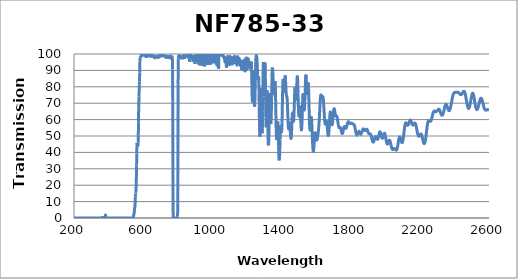
| Category | Transmission (%) |
|---|---|
| 2600.0 | 65.392 |
| 2599.0 | 65.569 |
| 2598.0 | 65.712 |
| 2597.0 | 65.833 |
| 2596.0 | 65.933 |
| 2595.0 | 66.007 |
| 2594.0 | 66.052 |
| 2593.0 | 66.114 |
| 2592.0 | 66.077 |
| 2591.0 | 66.056 |
| 2590.0 | 66.05 |
| 2589.0 | 66.052 |
| 2588.0 | 66.001 |
| 2587.0 | 65.917 |
| 2586.0 | 65.876 |
| 2585.0 | 65.834 |
| 2584.0 | 65.83 |
| 2583.0 | 65.81 |
| 2582.0 | 65.764 |
| 2581.0 | 65.782 |
| 2580.0 | 65.828 |
| 2579.0 | 65.907 |
| 2578.0 | 66.003 |
| 2577.0 | 66.11 |
| 2576.0 | 66.23 |
| 2575.0 | 66.378 |
| 2574.0 | 66.574 |
| 2573.0 | 66.798 |
| 2572.0 | 67.039 |
| 2571.0 | 67.352 |
| 2570.0 | 67.721 |
| 2569.0 | 68.146 |
| 2568.0 | 68.59 |
| 2567.0 | 69.084 |
| 2566.0 | 69.505 |
| 2565.0 | 69.982 |
| 2564.0 | 70.445 |
| 2563.0 | 70.91 |
| 2562.0 | 71.297 |
| 2561.0 | 71.649 |
| 2560.0 | 71.98 |
| 2559.0 | 72.282 |
| 2558.0 | 72.572 |
| 2557.0 | 72.751 |
| 2556.0 | 72.898 |
| 2555.0 | 72.986 |
| 2554.0 | 73.059 |
| 2553.0 | 73.054 |
| 2552.0 | 72.981 |
| 2551.0 | 72.816 |
| 2550.0 | 72.572 |
| 2549.0 | 72.279 |
| 2548.0 | 71.984 |
| 2547.0 | 71.616 |
| 2546.0 | 71.232 |
| 2545.0 | 70.837 |
| 2544.0 | 70.409 |
| 2543.0 | 69.989 |
| 2542.0 | 69.563 |
| 2541.0 | 69.101 |
| 2540.0 | 68.692 |
| 2539.0 | 68.259 |
| 2538.0 | 67.835 |
| 2537.0 | 67.445 |
| 2536.0 | 67.096 |
| 2535.0 | 66.797 |
| 2534.0 | 66.562 |
| 2533.0 | 66.352 |
| 2532.0 | 66.209 |
| 2531.0 | 66.12 |
| 2530.0 | 66.064 |
| 2529.0 | 66.136 |
| 2528.0 | 66.3 |
| 2527.0 | 66.479 |
| 2526.0 | 66.714 |
| 2525.0 | 66.999 |
| 2524.0 | 67.356 |
| 2523.0 | 67.778 |
| 2522.0 | 68.26 |
| 2521.0 | 68.773 |
| 2520.0 | 69.35 |
| 2519.0 | 69.96 |
| 2518.0 | 70.579 |
| 2517.0 | 71.29 |
| 2516.0 | 71.95 |
| 2515.0 | 72.606 |
| 2514.0 | 73.218 |
| 2513.0 | 73.827 |
| 2512.0 | 74.378 |
| 2511.0 | 74.853 |
| 2510.0 | 75.248 |
| 2509.0 | 75.572 |
| 2508.0 | 75.848 |
| 2507.0 | 75.979 |
| 2506.0 | 76.055 |
| 2505.0 | 76.059 |
| 2504.0 | 75.941 |
| 2503.0 | 75.688 |
| 2502.0 | 75.381 |
| 2501.0 | 75.04 |
| 2500.0 | 74.624 |
| 2499.0 | 74.088 |
| 2498.0 | 73.537 |
| 2497.0 | 72.972 |
| 2496.0 | 72.404 |
| 2495.0 | 71.796 |
| 2494.0 | 71.179 |
| 2493.0 | 70.555 |
| 2492.0 | 69.954 |
| 2491.0 | 69.397 |
| 2490.0 | 68.921 |
| 2489.0 | 68.477 |
| 2488.0 | 68.054 |
| 2487.0 | 67.668 |
| 2486.0 | 67.337 |
| 2485.0 | 67.088 |
| 2484.0 | 66.941 |
| 2483.0 | 66.849 |
| 2482.0 | 66.819 |
| 2481.0 | 66.855 |
| 2480.0 | 66.971 |
| 2479.0 | 67.151 |
| 2478.0 | 67.407 |
| 2477.0 | 67.737 |
| 2476.0 | 68.134 |
| 2475.0 | 68.574 |
| 2474.0 | 69.086 |
| 2473.0 | 69.625 |
| 2472.0 | 70.196 |
| 2471.0 | 70.812 |
| 2470.0 | 71.411 |
| 2469.0 | 72.019 |
| 2468.0 | 72.648 |
| 2467.0 | 73.296 |
| 2466.0 | 73.874 |
| 2465.0 | 74.433 |
| 2464.0 | 74.97 |
| 2463.0 | 75.485 |
| 2462.0 | 75.889 |
| 2461.0 | 76.26 |
| 2460.0 | 76.544 |
| 2459.0 | 76.79 |
| 2458.0 | 77.011 |
| 2457.0 | 77.162 |
| 2456.0 | 77.234 |
| 2455.0 | 77.255 |
| 2454.0 | 77.234 |
| 2453.0 | 77.16 |
| 2452.0 | 77.054 |
| 2451.0 | 76.942 |
| 2450.0 | 76.807 |
| 2449.0 | 76.628 |
| 2448.0 | 76.45 |
| 2447.0 | 76.275 |
| 2446.0 | 76.106 |
| 2445.0 | 75.931 |
| 2444.0 | 75.772 |
| 2443.0 | 75.622 |
| 2442.0 | 75.512 |
| 2441.0 | 75.399 |
| 2440.0 | 75.288 |
| 2439.0 | 75.223 |
| 2438.0 | 75.197 |
| 2437.0 | 75.196 |
| 2436.0 | 75.216 |
| 2435.0 | 75.24 |
| 2434.0 | 75.305 |
| 2433.0 | 75.419 |
| 2432.0 | 75.549 |
| 2431.0 | 75.673 |
| 2430.0 | 75.783 |
| 2429.0 | 75.884 |
| 2428.0 | 76.011 |
| 2427.0 | 76.131 |
| 2426.0 | 76.223 |
| 2425.0 | 76.307 |
| 2424.0 | 76.385 |
| 2423.0 | 76.463 |
| 2422.0 | 76.546 |
| 2421.0 | 76.616 |
| 2420.0 | 76.647 |
| 2419.0 | 76.647 |
| 2418.0 | 76.644 |
| 2417.0 | 76.643 |
| 2416.0 | 76.65 |
| 2415.0 | 76.65 |
| 2414.0 | 76.644 |
| 2413.0 | 76.627 |
| 2412.0 | 76.619 |
| 2411.0 | 76.622 |
| 2410.0 | 76.607 |
| 2409.0 | 76.602 |
| 2408.0 | 76.606 |
| 2407.0 | 76.613 |
| 2406.0 | 76.616 |
| 2405.0 | 76.615 |
| 2404.0 | 76.611 |
| 2403.0 | 76.58 |
| 2402.0 | 76.531 |
| 2401.0 | 76.476 |
| 2400.0 | 76.444 |
| 2399.0 | 76.409 |
| 2398.0 | 76.325 |
| 2397.0 | 76.189 |
| 2396.0 | 76.01 |
| 2395.0 | 75.796 |
| 2394.0 | 75.561 |
| 2393.0 | 75.313 |
| 2392.0 | 74.987 |
| 2391.0 | 74.599 |
| 2390.0 | 74.17 |
| 2389.0 | 73.706 |
| 2388.0 | 73.204 |
| 2387.0 | 72.679 |
| 2386.0 | 72.137 |
| 2385.0 | 71.579 |
| 2384.0 | 71.007 |
| 2383.0 | 70.424 |
| 2382.0 | 69.843 |
| 2381.0 | 69.275 |
| 2380.0 | 68.702 |
| 2379.0 | 68.167 |
| 2378.0 | 67.665 |
| 2377.0 | 67.224 |
| 2376.0 | 66.84 |
| 2375.0 | 66.502 |
| 2374.0 | 66.164 |
| 2373.0 | 65.874 |
| 2372.0 | 65.662 |
| 2371.0 | 65.535 |
| 2370.0 | 65.459 |
| 2369.0 | 65.438 |
| 2368.0 | 65.477 |
| 2367.0 | 65.561 |
| 2366.0 | 65.687 |
| 2365.0 | 65.869 |
| 2364.0 | 66.115 |
| 2363.0 | 66.384 |
| 2362.0 | 66.668 |
| 2361.0 | 66.985 |
| 2360.0 | 67.341 |
| 2359.0 | 67.702 |
| 2358.0 | 68.036 |
| 2357.0 | 68.313 |
| 2356.0 | 68.567 |
| 2355.0 | 68.815 |
| 2354.0 | 69.021 |
| 2353.0 | 69.188 |
| 2352.0 | 69.291 |
| 2351.0 | 69.297 |
| 2350.0 | 69.217 |
| 2349.0 | 69.112 |
| 2348.0 | 68.929 |
| 2347.0 | 68.699 |
| 2346.0 | 68.378 |
| 2345.0 | 68.01 |
| 2344.0 | 67.616 |
| 2343.0 | 67.184 |
| 2342.0 | 66.73 |
| 2341.0 | 66.258 |
| 2340.0 | 65.758 |
| 2339.0 | 65.282 |
| 2338.0 | 64.845 |
| 2337.0 | 64.443 |
| 2336.0 | 64.053 |
| 2335.0 | 63.687 |
| 2334.0 | 63.375 |
| 2333.0 | 63.109 |
| 2332.0 | 62.893 |
| 2331.0 | 62.749 |
| 2330.0 | 62.664 |
| 2329.0 | 62.631 |
| 2328.0 | 62.658 |
| 2327.0 | 62.703 |
| 2326.0 | 62.792 |
| 2325.0 | 62.936 |
| 2324.0 | 63.129 |
| 2323.0 | 63.364 |
| 2322.0 | 63.613 |
| 2321.0 | 63.92 |
| 2320.0 | 64.245 |
| 2319.0 | 64.555 |
| 2318.0 | 64.844 |
| 2317.0 | 65.141 |
| 2316.0 | 65.392 |
| 2315.0 | 65.642 |
| 2314.0 | 65.861 |
| 2313.0 | 66.066 |
| 2312.0 | 66.227 |
| 2311.0 | 66.312 |
| 2310.0 | 66.341 |
| 2309.0 | 66.341 |
| 2308.0 | 66.301 |
| 2307.0 | 66.231 |
| 2306.0 | 66.153 |
| 2305.0 | 66.035 |
| 2304.0 | 65.872 |
| 2303.0 | 65.712 |
| 2302.0 | 65.555 |
| 2301.0 | 65.421 |
| 2300.0 | 65.268 |
| 2299.0 | 65.144 |
| 2298.0 | 65.053 |
| 2297.0 | 64.975 |
| 2296.0 | 64.936 |
| 2295.0 | 64.87 |
| 2294.0 | 64.835 |
| 2293.0 | 64.83 |
| 2292.0 | 64.857 |
| 2291.0 | 64.901 |
| 2290.0 | 64.963 |
| 2289.0 | 65.046 |
| 2288.0 | 65.121 |
| 2287.0 | 65.16 |
| 2286.0 | 65.197 |
| 2285.0 | 65.22 |
| 2284.0 | 65.219 |
| 2283.0 | 65.169 |
| 2282.0 | 65.091 |
| 2281.0 | 64.98 |
| 2280.0 | 64.812 |
| 2279.0 | 64.631 |
| 2278.0 | 64.383 |
| 2277.0 | 64.058 |
| 2276.0 | 63.702 |
| 2275.0 | 63.325 |
| 2274.0 | 62.902 |
| 2273.0 | 62.465 |
| 2272.0 | 62.015 |
| 2271.0 | 61.587 |
| 2270.0 | 61.133 |
| 2269.0 | 60.74 |
| 2268.0 | 60.393 |
| 2267.0 | 60.045 |
| 2266.0 | 59.742 |
| 2265.0 | 59.493 |
| 2264.0 | 59.269 |
| 2263.0 | 59.108 |
| 2262.0 | 59.016 |
| 2261.0 | 58.966 |
| 2260.0 | 58.954 |
| 2259.0 | 58.952 |
| 2258.0 | 59.022 |
| 2257.0 | 59.155 |
| 2256.0 | 59.275 |
| 2255.0 | 59.371 |
| 2254.0 | 59.445 |
| 2253.0 | 59.472 |
| 2252.0 | 59.451 |
| 2251.0 | 59.435 |
| 2250.0 | 59.334 |
| 2249.0 | 59.173 |
| 2248.0 | 58.926 |
| 2247.0 | 58.584 |
| 2246.0 | 58.147 |
| 2245.0 | 57.635 |
| 2244.0 | 57.051 |
| 2243.0 | 56.355 |
| 2242.0 | 55.578 |
| 2241.0 | 54.774 |
| 2240.0 | 53.89 |
| 2239.0 | 53.035 |
| 2238.0 | 52.113 |
| 2237.0 | 51.259 |
| 2236.0 | 50.404 |
| 2235.0 | 49.577 |
| 2234.0 | 48.798 |
| 2233.0 | 48.076 |
| 2232.0 | 47.42 |
| 2231.0 | 46.856 |
| 2230.0 | 46.356 |
| 2229.0 | 45.979 |
| 2228.0 | 45.703 |
| 2227.0 | 45.499 |
| 2226.0 | 45.386 |
| 2225.0 | 45.328 |
| 2224.0 | 45.396 |
| 2223.0 | 45.529 |
| 2222.0 | 45.768 |
| 2221.0 | 46.08 |
| 2220.0 | 46.447 |
| 2219.0 | 46.852 |
| 2218.0 | 47.315 |
| 2217.0 | 47.786 |
| 2216.0 | 48.29 |
| 2215.0 | 48.755 |
| 2214.0 | 49.233 |
| 2213.0 | 49.713 |
| 2212.0 | 50.107 |
| 2211.0 | 50.447 |
| 2210.0 | 50.719 |
| 2209.0 | 50.936 |
| 2208.0 | 51.076 |
| 2207.0 | 51.149 |
| 2206.0 | 51.204 |
| 2205.0 | 51.189 |
| 2204.0 | 51.124 |
| 2203.0 | 50.978 |
| 2202.0 | 50.783 |
| 2201.0 | 50.603 |
| 2200.0 | 50.431 |
| 2199.0 | 50.266 |
| 2198.0 | 50.106 |
| 2197.0 | 49.983 |
| 2196.0 | 49.88 |
| 2195.0 | 49.856 |
| 2194.0 | 49.85 |
| 2193.0 | 49.902 |
| 2192.0 | 49.999 |
| 2191.0 | 50.164 |
| 2190.0 | 50.431 |
| 2189.0 | 50.716 |
| 2188.0 | 51.083 |
| 2187.0 | 51.518 |
| 2186.0 | 51.992 |
| 2185.0 | 52.482 |
| 2184.0 | 53.045 |
| 2183.0 | 53.653 |
| 2182.0 | 54.217 |
| 2181.0 | 54.83 |
| 2180.0 | 55.368 |
| 2179.0 | 55.875 |
| 2178.0 | 56.347 |
| 2177.0 | 56.821 |
| 2176.0 | 57.155 |
| 2175.0 | 57.429 |
| 2174.0 | 57.618 |
| 2173.0 | 57.769 |
| 2172.0 | 57.888 |
| 2171.0 | 57.874 |
| 2170.0 | 57.807 |
| 2169.0 | 57.692 |
| 2168.0 | 57.545 |
| 2167.0 | 57.423 |
| 2166.0 | 57.256 |
| 2165.0 | 57.059 |
| 2164.0 | 56.901 |
| 2163.0 | 56.741 |
| 2162.0 | 56.638 |
| 2161.0 | 56.617 |
| 2160.0 | 56.62 |
| 2159.0 | 56.644 |
| 2158.0 | 56.736 |
| 2157.0 | 56.884 |
| 2156.0 | 57.14 |
| 2155.0 | 57.394 |
| 2154.0 | 57.67 |
| 2153.0 | 57.951 |
| 2152.0 | 58.289 |
| 2151.0 | 58.65 |
| 2150.0 | 58.939 |
| 2149.0 | 59.199 |
| 2148.0 | 59.406 |
| 2147.0 | 59.558 |
| 2146.0 | 59.686 |
| 2145.0 | 59.691 |
| 2144.0 | 59.682 |
| 2143.0 | 59.561 |
| 2142.0 | 59.381 |
| 2141.0 | 59.184 |
| 2140.0 | 58.93 |
| 2139.0 | 58.604 |
| 2138.0 | 58.248 |
| 2137.0 | 57.942 |
| 2136.0 | 57.637 |
| 2135.0 | 57.33 |
| 2134.0 | 57.076 |
| 2133.0 | 56.878 |
| 2132.0 | 56.725 |
| 2131.0 | 56.59 |
| 2130.0 | 56.507 |
| 2129.0 | 56.526 |
| 2128.0 | 56.609 |
| 2127.0 | 56.734 |
| 2126.0 | 56.876 |
| 2125.0 | 57.061 |
| 2124.0 | 57.294 |
| 2123.0 | 57.535 |
| 2122.0 | 57.726 |
| 2121.0 | 57.886 |
| 2120.0 | 58.003 |
| 2119.0 | 58.038 |
| 2118.0 | 57.981 |
| 2117.0 | 57.804 |
| 2116.0 | 57.503 |
| 2115.0 | 57.111 |
| 2114.0 | 56.593 |
| 2113.0 | 55.988 |
| 2112.0 | 55.234 |
| 2111.0 | 54.438 |
| 2110.0 | 53.562 |
| 2109.0 | 52.667 |
| 2108.0 | 51.734 |
| 2107.0 | 50.841 |
| 2106.0 | 49.953 |
| 2105.0 | 49.168 |
| 2104.0 | 48.407 |
| 2103.0 | 47.741 |
| 2102.0 | 47.183 |
| 2101.0 | 46.738 |
| 2100.0 | 46.382 |
| 2099.0 | 46.129 |
| 2098.0 | 45.999 |
| 2097.0 | 45.979 |
| 2096.0 | 46.036 |
| 2095.0 | 46.167 |
| 2094.0 | 46.39 |
| 2093.0 | 46.671 |
| 2092.0 | 47.017 |
| 2091.0 | 47.417 |
| 2090.0 | 47.808 |
| 2089.0 | 48.195 |
| 2088.0 | 48.561 |
| 2087.0 | 48.913 |
| 2086.0 | 49.168 |
| 2085.0 | 49.332 |
| 2084.0 | 49.405 |
| 2083.0 | 49.385 |
| 2082.0 | 49.257 |
| 2081.0 | 49.034 |
| 2080.0 | 48.679 |
| 2079.0 | 48.213 |
| 2078.0 | 47.654 |
| 2077.0 | 47.046 |
| 2076.0 | 46.442 |
| 2075.0 | 45.805 |
| 2074.0 | 45.115 |
| 2073.0 | 44.457 |
| 2072.0 | 43.848 |
| 2071.0 | 43.308 |
| 2070.0 | 42.828 |
| 2069.0 | 42.4 |
| 2068.0 | 42.047 |
| 2067.0 | 41.775 |
| 2066.0 | 41.597 |
| 2065.0 | 41.481 |
| 2064.0 | 41.404 |
| 2063.0 | 41.387 |
| 2062.0 | 41.444 |
| 2061.0 | 41.556 |
| 2060.0 | 41.667 |
| 2059.0 | 41.789 |
| 2058.0 | 41.915 |
| 2057.0 | 42.056 |
| 2056.0 | 42.206 |
| 2055.0 | 42.303 |
| 2054.0 | 42.35 |
| 2053.0 | 42.37 |
| 2052.0 | 42.362 |
| 2051.0 | 42.343 |
| 2050.0 | 42.303 |
| 2049.0 | 42.216 |
| 2048.0 | 42.107 |
| 2047.0 | 42.011 |
| 2046.0 | 41.938 |
| 2045.0 | 41.856 |
| 2044.0 | 41.787 |
| 2043.0 | 41.754 |
| 2042.0 | 41.794 |
| 2041.0 | 41.888 |
| 2040.0 | 42.018 |
| 2039.0 | 42.209 |
| 2038.0 | 42.465 |
| 2037.0 | 42.816 |
| 2036.0 | 43.213 |
| 2035.0 | 43.634 |
| 2034.0 | 44.086 |
| 2033.0 | 44.561 |
| 2032.0 | 45.092 |
| 2031.0 | 45.608 |
| 2030.0 | 46.072 |
| 2029.0 | 46.509 |
| 2028.0 | 46.88 |
| 2027.0 | 47.142 |
| 2026.0 | 47.312 |
| 2025.0 | 47.403 |
| 2024.0 | 47.418 |
| 2023.0 | 47.343 |
| 2022.0 | 47.169 |
| 2021.0 | 46.926 |
| 2020.0 | 46.644 |
| 2019.0 | 46.35 |
| 2018.0 | 46.05 |
| 2017.0 | 45.751 |
| 2016.0 | 45.477 |
| 2015.0 | 45.267 |
| 2014.0 | 45.143 |
| 2013.0 | 45.07 |
| 2012.0 | 45.057 |
| 2011.0 | 45.161 |
| 2010.0 | 45.36 |
| 2009.0 | 45.627 |
| 2008.0 | 45.971 |
| 2007.0 | 46.398 |
| 2006.0 | 46.908 |
| 2005.0 | 47.502 |
| 2004.0 | 48.126 |
| 2003.0 | 48.756 |
| 2002.0 | 49.373 |
| 2001.0 | 49.956 |
| 2000.0 | 50.493 |
| 1999.0 | 50.958 |
| 1998.0 | 51.348 |
| 1997.0 | 51.611 |
| 1996.0 | 51.704 |
| 1995.0 | 51.689 |
| 1994.0 | 51.563 |
| 1993.0 | 51.325 |
| 1992.0 | 51.027 |
| 1991.0 | 50.681 |
| 1990.0 | 50.28 |
| 1989.0 | 49.865 |
| 1988.0 | 49.491 |
| 1987.0 | 49.151 |
| 1986.0 | 48.878 |
| 1985.0 | 48.69 |
| 1984.0 | 48.59 |
| 1983.0 | 48.575 |
| 1982.0 | 48.665 |
| 1981.0 | 48.863 |
| 1980.0 | 49.138 |
| 1979.0 | 49.478 |
| 1978.0 | 49.879 |
| 1977.0 | 50.319 |
| 1976.0 | 50.777 |
| 1975.0 | 51.241 |
| 1974.0 | 51.651 |
| 1973.0 | 52.009 |
| 1972.0 | 52.297 |
| 1971.0 | 52.479 |
| 1970.0 | 52.549 |
| 1969.0 | 52.524 |
| 1968.0 | 52.401 |
| 1967.0 | 52.131 |
| 1966.0 | 51.786 |
| 1965.0 | 51.393 |
| 1964.0 | 50.915 |
| 1963.0 | 50.426 |
| 1962.0 | 49.946 |
| 1961.0 | 49.439 |
| 1960.0 | 49.002 |
| 1959.0 | 48.641 |
| 1958.0 | 48.327 |
| 1957.0 | 48.072 |
| 1956.0 | 47.949 |
| 1955.0 | 47.919 |
| 1954.0 | 47.967 |
| 1953.0 | 48.069 |
| 1952.0 | 48.215 |
| 1951.0 | 48.44 |
| 1950.0 | 48.717 |
| 1949.0 | 49.013 |
| 1948.0 | 49.288 |
| 1947.0 | 49.483 |
| 1946.0 | 49.63 |
| 1945.0 | 49.702 |
| 1944.0 | 49.716 |
| 1943.0 | 49.674 |
| 1942.0 | 49.539 |
| 1941.0 | 49.295 |
| 1940.0 | 48.973 |
| 1939.0 | 48.599 |
| 1938.0 | 48.197 |
| 1937.0 | 47.804 |
| 1936.0 | 47.465 |
| 1935.0 | 47.104 |
| 1934.0 | 46.808 |
| 1933.0 | 46.572 |
| 1932.0 | 46.392 |
| 1931.0 | 46.303 |
| 1930.0 | 46.276 |
| 1929.0 | 46.337 |
| 1928.0 | 46.477 |
| 1927.0 | 46.686 |
| 1926.0 | 46.993 |
| 1925.0 | 47.381 |
| 1924.0 | 47.795 |
| 1923.0 | 48.266 |
| 1922.0 | 48.752 |
| 1921.0 | 49.211 |
| 1920.0 | 49.618 |
| 1919.0 | 49.984 |
| 1918.0 | 50.363 |
| 1917.0 | 50.702 |
| 1916.0 | 50.992 |
| 1915.0 | 51.16 |
| 1914.0 | 51.274 |
| 1913.0 | 51.291 |
| 1912.0 | 51.288 |
| 1911.0 | 51.223 |
| 1910.0 | 51.207 |
| 1909.0 | 51.257 |
| 1908.0 | 51.348 |
| 1907.0 | 51.427 |
| 1906.0 | 51.443 |
| 1905.0 | 51.495 |
| 1904.0 | 51.609 |
| 1903.0 | 51.796 |
| 1902.0 | 52.056 |
| 1901.0 | 52.348 |
| 1900.0 | 52.662 |
| 1899.0 | 52.96 |
| 1898.0 | 53.188 |
| 1897.0 | 53.477 |
| 1896.0 | 53.708 |
| 1895.0 | 53.908 |
| 1894.0 | 54.059 |
| 1893.0 | 54.178 |
| 1892.0 | 54.149 |
| 1891.0 | 54.033 |
| 1890.0 | 53.932 |
| 1889.0 | 53.794 |
| 1888.0 | 53.716 |
| 1887.0 | 53.661 |
| 1886.0 | 53.568 |
| 1885.0 | 53.449 |
| 1884.0 | 53.37 |
| 1883.0 | 53.36 |
| 1882.0 | 53.325 |
| 1881.0 | 53.362 |
| 1880.0 | 53.483 |
| 1879.0 | 53.666 |
| 1878.0 | 53.864 |
| 1877.0 | 54.047 |
| 1876.0 | 54.176 |
| 1875.0 | 54.271 |
| 1874.0 | 54.36 |
| 1873.0 | 54.333 |
| 1872.0 | 54.259 |
| 1871.0 | 54.116 |
| 1870.0 | 53.955 |
| 1869.0 | 53.635 |
| 1868.0 | 53.331 |
| 1867.0 | 53.051 |
| 1866.0 | 52.75 |
| 1865.0 | 52.447 |
| 1864.0 | 52.186 |
| 1863.0 | 51.946 |
| 1862.0 | 51.728 |
| 1861.0 | 51.508 |
| 1860.0 | 51.239 |
| 1859.0 | 51.073 |
| 1858.0 | 51.042 |
| 1857.0 | 51.123 |
| 1856.0 | 51.304 |
| 1855.0 | 51.524 |
| 1854.0 | 51.765 |
| 1853.0 | 51.942 |
| 1852.0 | 52.169 |
| 1851.0 | 52.398 |
| 1850.0 | 52.683 |
| 1849.0 | 52.849 |
| 1848.0 | 52.923 |
| 1847.0 | 52.741 |
| 1846.0 | 52.537 |
| 1845.0 | 52.405 |
| 1844.0 | 52.354 |
| 1843.0 | 52.298 |
| 1842.0 | 52.101 |
| 1841.0 | 51.688 |
| 1840.0 | 51.252 |
| 1839.0 | 50.874 |
| 1838.0 | 50.665 |
| 1837.0 | 50.575 |
| 1836.0 | 50.537 |
| 1835.0 | 50.561 |
| 1834.0 | 50.714 |
| 1833.0 | 50.99 |
| 1832.0 | 51.365 |
| 1831.0 | 51.829 |
| 1830.0 | 52.272 |
| 1829.0 | 52.716 |
| 1828.0 | 53.228 |
| 1827.0 | 53.833 |
| 1826.0 | 54.394 |
| 1825.0 | 54.982 |
| 1824.0 | 55.434 |
| 1823.0 | 55.891 |
| 1822.0 | 56.237 |
| 1821.0 | 56.553 |
| 1820.0 | 56.712 |
| 1819.0 | 56.834 |
| 1818.0 | 56.906 |
| 1817.0 | 57.101 |
| 1816.0 | 57.234 |
| 1815.0 | 57.312 |
| 1814.0 | 57.339 |
| 1813.0 | 57.37 |
| 1812.0 | 57.407 |
| 1811.0 | 57.443 |
| 1810.0 | 57.498 |
| 1809.0 | 57.573 |
| 1808.0 | 57.657 |
| 1807.0 | 57.758 |
| 1806.0 | 57.813 |
| 1805.0 | 57.841 |
| 1804.0 | 57.823 |
| 1803.0 | 57.809 |
| 1802.0 | 57.759 |
| 1801.0 | 57.762 |
| 1800.0 | 57.725 |
| 1799.0 | 57.668 |
| 1798.0 | 57.592 |
| 1797.0 | 57.602 |
| 1796.0 | 57.661 |
| 1795.0 | 57.737 |
| 1794.0 | 57.802 |
| 1793.0 | 57.927 |
| 1792.0 | 58.074 |
| 1791.0 | 58.223 |
| 1790.0 | 58.396 |
| 1789.0 | 58.536 |
| 1788.0 | 58.646 |
| 1787.0 | 58.727 |
| 1786.0 | 58.729 |
| 1785.0 | 58.601 |
| 1784.0 | 58.422 |
| 1783.0 | 58.16 |
| 1782.0 | 57.835 |
| 1781.0 | 57.436 |
| 1780.0 | 56.981 |
| 1779.0 | 56.52 |
| 1778.0 | 56.041 |
| 1777.0 | 55.661 |
| 1776.0 | 55.321 |
| 1775.0 | 55.029 |
| 1774.0 | 54.838 |
| 1773.0 | 54.724 |
| 1772.0 | 54.696 |
| 1771.0 | 54.752 |
| 1770.0 | 54.885 |
| 1769.0 | 55.056 |
| 1768.0 | 55.274 |
| 1767.0 | 55.485 |
| 1766.0 | 55.667 |
| 1765.0 | 55.775 |
| 1764.0 | 55.819 |
| 1763.0 | 55.75 |
| 1762.0 | 55.552 |
| 1761.0 | 55.254 |
| 1760.0 | 54.848 |
| 1759.0 | 54.372 |
| 1758.0 | 53.871 |
| 1757.0 | 53.321 |
| 1756.0 | 52.809 |
| 1755.0 | 52.319 |
| 1754.0 | 51.928 |
| 1753.0 | 51.65 |
| 1752.0 | 51.498 |
| 1751.0 | 51.479 |
| 1750.0 | 51.577 |
| 1749.0 | 51.813 |
| 1748.0 | 52.139 |
| 1747.0 | 52.582 |
| 1746.0 | 53.041 |
| 1745.0 | 53.533 |
| 1744.0 | 54.012 |
| 1743.0 | 54.452 |
| 1742.0 | 54.779 |
| 1741.0 | 55.031 |
| 1740.0 | 55.184 |
| 1739.0 | 55.248 |
| 1738.0 | 55.231 |
| 1737.0 | 55.183 |
| 1736.0 | 55.09 |
| 1735.0 | 55.034 |
| 1734.0 | 55.037 |
| 1733.0 | 55.107 |
| 1732.0 | 55.257 |
| 1731.0 | 55.516 |
| 1730.0 | 55.913 |
| 1729.0 | 56.437 |
| 1728.0 | 57.062 |
| 1727.0 | 57.797 |
| 1726.0 | 58.533 |
| 1725.0 | 59.296 |
| 1724.0 | 60.021 |
| 1723.0 | 60.7 |
| 1722.0 | 61.285 |
| 1721.0 | 61.718 |
| 1720.0 | 62.013 |
| 1719.0 | 62.18 |
| 1718.0 | 62.234 |
| 1717.0 | 62.225 |
| 1716.0 | 62.194 |
| 1715.0 | 62.178 |
| 1714.0 | 62.224 |
| 1713.0 | 62.408 |
| 1712.0 | 62.738 |
| 1711.0 | 63.189 |
| 1710.0 | 63.742 |
| 1709.0 | 64.393 |
| 1708.0 | 65.063 |
| 1707.0 | 65.718 |
| 1706.0 | 66.238 |
| 1705.0 | 66.58 |
| 1704.0 | 66.623 |
| 1703.0 | 66.351 |
| 1702.0 | 65.774 |
| 1701.0 | 64.908 |
| 1700.0 | 63.832 |
| 1699.0 | 62.592 |
| 1698.0 | 61.334 |
| 1697.0 | 60.065 |
| 1696.0 | 58.924 |
| 1695.0 | 57.982 |
| 1694.0 | 57.323 |
| 1693.0 | 56.963 |
| 1692.0 | 56.915 |
| 1691.0 | 57.177 |
| 1690.0 | 57.781 |
| 1689.0 | 58.682 |
| 1688.0 | 59.781 |
| 1687.0 | 61.005 |
| 1686.0 | 62.217 |
| 1685.0 | 63.331 |
| 1684.0 | 64.171 |
| 1683.0 | 64.63 |
| 1682.0 | 64.574 |
| 1681.0 | 63.98 |
| 1680.0 | 62.863 |
| 1679.0 | 61.287 |
| 1678.0 | 59.511 |
| 1677.0 | 57.648 |
| 1676.0 | 55.743 |
| 1675.0 | 53.985 |
| 1674.0 | 52.518 |
| 1673.0 | 51.375 |
| 1672.0 | 50.646 |
| 1671.0 | 50.289 |
| 1670.0 | 50.331 |
| 1669.0 | 50.728 |
| 1668.0 | 51.454 |
| 1667.0 | 52.437 |
| 1666.0 | 53.598 |
| 1665.0 | 54.861 |
| 1664.0 | 56.095 |
| 1663.0 | 57.203 |
| 1662.0 | 58.082 |
| 1661.0 | 58.699 |
| 1660.0 | 58.99 |
| 1659.0 | 58.961 |
| 1658.0 | 58.707 |
| 1657.0 | 58.308 |
| 1656.0 | 57.863 |
| 1655.0 | 57.49 |
| 1654.0 | 57.253 |
| 1653.0 | 57.225 |
| 1652.0 | 57.489 |
| 1651.0 | 58.115 |
| 1650.0 | 59.06 |
| 1649.0 | 60.26 |
| 1648.0 | 61.762 |
| 1647.0 | 63.509 |
| 1646.0 | 65.419 |
| 1645.0 | 67.4 |
| 1644.0 | 69.246 |
| 1643.0 | 70.868 |
| 1642.0 | 72.242 |
| 1641.0 | 73.217 |
| 1640.0 | 73.768 |
| 1639.0 | 73.999 |
| 1638.0 | 73.942 |
| 1637.0 | 73.727 |
| 1636.0 | 73.487 |
| 1635.0 | 73.337 |
| 1634.0 | 73.325 |
| 1633.0 | 73.475 |
| 1632.0 | 73.773 |
| 1631.0 | 74.176 |
| 1630.0 | 74.619 |
| 1629.0 | 74.966 |
| 1628.0 | 75.109 |
| 1627.0 | 74.948 |
| 1626.0 | 74.353 |
| 1625.0 | 73.293 |
| 1624.0 | 71.809 |
| 1623.0 | 69.972 |
| 1622.0 | 67.885 |
| 1621.0 | 65.711 |
| 1620.0 | 63.516 |
| 1619.0 | 61.347 |
| 1618.0 | 59.422 |
| 1617.0 | 57.732 |
| 1616.0 | 56.216 |
| 1615.0 | 54.897 |
| 1614.0 | 53.719 |
| 1613.0 | 52.701 |
| 1612.0 | 51.832 |
| 1611.0 | 51.054 |
| 1610.0 | 50.336 |
| 1609.0 | 49.664 |
| 1608.0 | 49.035 |
| 1607.0 | 48.475 |
| 1606.0 | 48.01 |
| 1605.0 | 47.678 |
| 1604.0 | 47.487 |
| 1603.0 | 47.457 |
| 1602.0 | 47.633 |
| 1601.0 | 48.011 |
| 1600.0 | 48.595 |
| 1599.0 | 49.347 |
| 1598.0 | 50.164 |
| 1597.0 | 50.93 |
| 1596.0 | 51.568 |
| 1595.0 | 51.928 |
| 1594.0 | 51.871 |
| 1593.0 | 51.364 |
| 1592.0 | 50.374 |
| 1591.0 | 49.029 |
| 1590.0 | 47.407 |
| 1589.0 | 45.714 |
| 1588.0 | 44.098 |
| 1587.0 | 42.684 |
| 1586.0 | 41.585 |
| 1585.0 | 40.896 |
| 1584.0 | 40.68 |
| 1583.0 | 40.961 |
| 1582.0 | 41.872 |
| 1581.0 | 43.265 |
| 1580.0 | 45.173 |
| 1579.0 | 47.534 |
| 1578.0 | 50.294 |
| 1577.0 | 53.21 |
| 1576.0 | 56.087 |
| 1575.0 | 58.504 |
| 1574.0 | 60.369 |
| 1573.0 | 61.286 |
| 1572.0 | 61.251 |
| 1571.0 | 60.442 |
| 1570.0 | 59.074 |
| 1569.0 | 57.429 |
| 1568.0 | 55.751 |
| 1567.0 | 54.486 |
| 1566.0 | 53.73 |
| 1565.0 | 53.609 |
| 1564.0 | 54.255 |
| 1563.0 | 55.741 |
| 1562.0 | 58.109 |
| 1561.0 | 61.225 |
| 1560.0 | 65.104 |
| 1559.0 | 69.454 |
| 1558.0 | 73.83 |
| 1557.0 | 77.761 |
| 1556.0 | 80.807 |
| 1555.0 | 82.421 |
| 1554.0 | 82.668 |
| 1553.0 | 81.852 |
| 1552.0 | 80.251 |
| 1551.0 | 78.454 |
| 1550.0 | 76.885 |
| 1549.0 | 75.963 |
| 1548.0 | 75.884 |
| 1547.0 | 76.623 |
| 1546.0 | 78.213 |
| 1545.0 | 80.428 |
| 1544.0 | 82.974 |
| 1543.0 | 85.308 |
| 1542.0 | 86.929 |
| 1541.0 | 87.444 |
| 1540.0 | 86.595 |
| 1539.0 | 84.428 |
| 1538.0 | 81.207 |
| 1537.0 | 77.707 |
| 1536.0 | 74.079 |
| 1535.0 | 70.866 |
| 1534.0 | 68.287 |
| 1533.0 | 66.563 |
| 1532.0 | 65.8 |
| 1531.0 | 66.022 |
| 1530.0 | 67.155 |
| 1529.0 | 68.866 |
| 1528.0 | 71.083 |
| 1527.0 | 73.302 |
| 1526.0 | 75.107 |
| 1525.0 | 75.979 |
| 1524.0 | 75.575 |
| 1523.0 | 73.838 |
| 1522.0 | 70.794 |
| 1521.0 | 67.237 |
| 1520.0 | 63.282 |
| 1519.0 | 59.871 |
| 1518.0 | 57.015 |
| 1517.0 | 54.965 |
| 1516.0 | 53.824 |
| 1515.0 | 53.702 |
| 1514.0 | 54.474 |
| 1513.0 | 56.019 |
| 1512.0 | 58.247 |
| 1511.0 | 60.838 |
| 1510.0 | 63.516 |
| 1509.0 | 65.83 |
| 1508.0 | 67.378 |
| 1507.0 | 67.92 |
| 1506.0 | 67.502 |
| 1505.0 | 66.335 |
| 1504.0 | 64.789 |
| 1503.0 | 63.356 |
| 1502.0 | 62.294 |
| 1501.0 | 62.041 |
| 1500.0 | 62.596 |
| 1499.0 | 64.093 |
| 1498.0 | 66.59 |
| 1497.0 | 69.968 |
| 1496.0 | 74.085 |
| 1495.0 | 78.265 |
| 1494.0 | 82.31 |
| 1493.0 | 85.311 |
| 1492.0 | 86.884 |
| 1491.0 | 86.694 |
| 1490.0 | 84.919 |
| 1489.0 | 82.222 |
| 1488.0 | 78.916 |
| 1487.0 | 76.187 |
| 1486.0 | 73.999 |
| 1485.0 | 72.665 |
| 1484.0 | 72.372 |
| 1483.0 | 73.071 |
| 1482.0 | 74.61 |
| 1481.0 | 76.551 |
| 1480.0 | 78.543 |
| 1479.0 | 79.852 |
| 1478.0 | 79.947 |
| 1477.0 | 78.697 |
| 1476.0 | 76.021 |
| 1475.0 | 72.621 |
| 1474.0 | 68.751 |
| 1473.0 | 65.324 |
| 1472.0 | 62.405 |
| 1471.0 | 60.345 |
| 1470.0 | 59.206 |
| 1469.0 | 59.022 |
| 1468.0 | 59.626 |
| 1467.0 | 60.801 |
| 1466.0 | 62.212 |
| 1465.0 | 63.449 |
| 1464.0 | 63.98 |
| 1463.0 | 63.658 |
| 1462.0 | 62.343 |
| 1461.0 | 60.219 |
| 1460.0 | 57.547 |
| 1459.0 | 54.67 |
| 1458.0 | 52.356 |
| 1457.0 | 50.414 |
| 1456.0 | 49.087 |
| 1455.0 | 48.523 |
| 1454.0 | 48.652 |
| 1453.0 | 49.489 |
| 1452.0 | 50.831 |
| 1451.0 | 52.611 |
| 1450.0 | 54.512 |
| 1449.0 | 56.073 |
| 1448.0 | 57.247 |
| 1447.0 | 57.756 |
| 1446.0 | 57.666 |
| 1445.0 | 56.946 |
| 1444.0 | 55.941 |
| 1443.0 | 55.013 |
| 1442.0 | 54.343 |
| 1441.0 | 54.333 |
| 1440.0 | 55.001 |
| 1439.0 | 56.441 |
| 1438.0 | 58.596 |
| 1437.0 | 61.364 |
| 1436.0 | 64.505 |
| 1435.0 | 67.485 |
| 1434.0 | 70.369 |
| 1433.0 | 72.306 |
| 1432.0 | 73.547 |
| 1431.0 | 74.097 |
| 1430.0 | 74.239 |
| 1429.0 | 74.398 |
| 1428.0 | 75.026 |
| 1427.0 | 76.125 |
| 1426.0 | 77.942 |
| 1425.0 | 80.173 |
| 1424.0 | 82.778 |
| 1423.0 | 85.058 |
| 1422.0 | 86.59 |
| 1421.0 | 86.931 |
| 1420.0 | 86.036 |
| 1419.0 | 84.08 |
| 1418.0 | 81.641 |
| 1417.0 | 79.535 |
| 1416.0 | 77.81 |
| 1415.0 | 77.086 |
| 1414.0 | 77.445 |
| 1413.0 | 78.802 |
| 1412.0 | 80.786 |
| 1411.0 | 82.945 |
| 1410.0 | 84.632 |
| 1409.0 | 84.799 |
| 1408.0 | 83.074 |
| 1407.0 | 79.249 |
| 1406.0 | 74.338 |
| 1405.0 | 68.593 |
| 1404.0 | 62.835 |
| 1403.0 | 58.22 |
| 1402.0 | 55.002 |
| 1401.0 | 53.191 |
| 1400.0 | 52.505 |
| 1399.0 | 52.727 |
| 1398.0 | 53.813 |
| 1397.0 | 55.303 |
| 1396.0 | 56.444 |
| 1395.0 | 56.342 |
| 1394.0 | 54.698 |
| 1393.0 | 51.941 |
| 1392.0 | 47.827 |
| 1391.0 | 43.782 |
| 1390.0 | 40.361 |
| 1389.0 | 37.76 |
| 1388.0 | 35.977 |
| 1387.0 | 35.091 |
| 1386.0 | 35.448 |
| 1385.0 | 37.005 |
| 1384.0 | 39.706 |
| 1383.0 | 43.695 |
| 1382.0 | 48.386 |
| 1381.0 | 52.935 |
| 1380.0 | 56.617 |
| 1379.0 | 58.831 |
| 1378.0 | 58.939 |
| 1377.0 | 57.271 |
| 1376.0 | 54.549 |
| 1375.0 | 51.753 |
| 1374.0 | 49.224 |
| 1373.0 | 47.759 |
| 1372.0 | 47.504 |
| 1371.0 | 48.655 |
| 1370.0 | 51.091 |
| 1369.0 | 54.72 |
| 1368.0 | 59.88 |
| 1367.0 | 66.127 |
| 1366.0 | 72.136 |
| 1365.0 | 77.698 |
| 1364.0 | 81.727 |
| 1363.0 | 83.477 |
| 1362.0 | 82.979 |
| 1361.0 | 81.201 |
| 1360.0 | 78.995 |
| 1359.0 | 77.178 |
| 1358.0 | 76.107 |
| 1357.0 | 75.751 |
| 1356.0 | 76.368 |
| 1355.0 | 77.55 |
| 1354.0 | 79.303 |
| 1353.0 | 81.316 |
| 1352.0 | 83.742 |
| 1351.0 | 86.241 |
| 1350.0 | 88.679 |
| 1349.0 | 90.595 |
| 1348.0 | 91.773 |
| 1347.0 | 91.49 |
| 1346.0 | 89.44 |
| 1345.0 | 85.455 |
| 1344.0 | 80.1 |
| 1343.0 | 74.247 |
| 1342.0 | 68.256 |
| 1341.0 | 63.234 |
| 1340.0 | 59.737 |
| 1339.0 | 57.66 |
| 1338.0 | 57.324 |
| 1337.0 | 58.728 |
| 1336.0 | 61.834 |
| 1335.0 | 66.132 |
| 1334.0 | 70.96 |
| 1333.0 | 74.775 |
| 1332.0 | 76.22 |
| 1331.0 | 74.144 |
| 1330.0 | 69.142 |
| 1329.0 | 62.588 |
| 1328.0 | 55.773 |
| 1327.0 | 50.071 |
| 1326.0 | 46.191 |
| 1325.0 | 44.275 |
| 1324.0 | 44.33 |
| 1323.0 | 46.492 |
| 1322.0 | 50.835 |
| 1321.0 | 57.179 |
| 1320.0 | 65 |
| 1319.0 | 72.463 |
| 1318.0 | 77.387 |
| 1317.0 | 77.781 |
| 1316.0 | 73.968 |
| 1315.0 | 67.833 |
| 1314.0 | 61.609 |
| 1313.0 | 57.31 |
| 1312.0 | 55.321 |
| 1311.0 | 56.037 |
| 1310.0 | 59.428 |
| 1309.0 | 65.516 |
| 1308.0 | 73.946 |
| 1307.0 | 83.047 |
| 1306.0 | 90.814 |
| 1305.0 | 94.765 |
| 1304.0 | 94.102 |
| 1303.0 | 90.094 |
| 1302.0 | 85.241 |
| 1301.0 | 81.499 |
| 1300.0 | 80.081 |
| 1299.0 | 81.503 |
| 1298.0 | 85.332 |
| 1297.0 | 90.34 |
| 1296.0 | 94.441 |
| 1295.0 | 95.125 |
| 1294.0 | 91.198 |
| 1293.0 | 83.48 |
| 1292.0 | 74.039 |
| 1291.0 | 65.027 |
| 1290.0 | 57.921 |
| 1289.0 | 53.497 |
| 1288.0 | 51.641 |
| 1287.0 | 52.439 |
| 1286.0 | 55.78 |
| 1285.0 | 61.454 |
| 1284.0 | 68.686 |
| 1283.0 | 75.41 |
| 1282.0 | 79.099 |
| 1281.0 | 78.284 |
| 1280.0 | 73.062 |
| 1279.0 | 65.678 |
| 1278.0 | 58.641 |
| 1277.0 | 53.31 |
| 1276.0 | 50.243 |
| 1275.0 | 49.635 |
| 1274.0 | 51.31 |
| 1273.0 | 55.175 |
| 1272.0 | 61.099 |
| 1271.0 | 68.483 |
| 1270.0 | 75.915 |
| 1269.0 | 81.907 |
| 1268.0 | 85.529 |
| 1267.0 | 86.509 |
| 1266.0 | 85.802 |
| 1265.0 | 84.644 |
| 1264.0 | 84.086 |
| 1263.0 | 84.756 |
| 1262.0 | 86.647 |
| 1261.0 | 89.366 |
| 1260.0 | 92.414 |
| 1259.0 | 95.098 |
| 1258.0 | 97.014 |
| 1257.0 | 98.15 |
| 1256.0 | 98.698 |
| 1255.0 | 98.94 |
| 1254.0 | 99.025 |
| 1253.0 | 98.81 |
| 1252.0 | 97.838 |
| 1251.0 | 95.585 |
| 1250.0 | 91.853 |
| 1249.0 | 86.731 |
| 1248.0 | 80.983 |
| 1247.0 | 75.617 |
| 1246.0 | 71.279 |
| 1245.0 | 68.561 |
| 1244.0 | 67.854 |
| 1243.0 | 69.358 |
| 1242.0 | 72.894 |
| 1241.0 | 78.059 |
| 1240.0 | 83.783 |
| 1239.0 | 88.31 |
| 1238.0 | 90.081 |
| 1237.0 | 88.462 |
| 1236.0 | 84.325 |
| 1235.0 | 79.04 |
| 1234.0 | 74.338 |
| 1233.0 | 71.34 |
| 1232.0 | 70.42 |
| 1231.0 | 71.775 |
| 1230.0 | 75.062 |
| 1229.0 | 79.895 |
| 1228.0 | 85.359 |
| 1227.0 | 90.349 |
| 1226.0 | 93.914 |
| 1225.0 | 95.429 |
| 1224.0 | 95.109 |
| 1223.0 | 93.707 |
| 1222.0 | 92.292 |
| 1221.0 | 91.391 |
| 1220.0 | 91.228 |
| 1219.0 | 91.739 |
| 1218.0 | 92.546 |
| 1217.0 | 93.411 |
| 1216.0 | 93.994 |
| 1215.0 | 94.203 |
| 1214.0 | 94.165 |
| 1213.0 | 94.106 |
| 1212.0 | 94.283 |
| 1211.0 | 94.853 |
| 1210.0 | 95.684 |
| 1209.0 | 96.546 |
| 1208.0 | 97.063 |
| 1207.0 | 96.924 |
| 1206.0 | 96.032 |
| 1205.0 | 94.541 |
| 1204.0 | 92.904 |
| 1203.0 | 91.542 |
| 1202.0 | 90.905 |
| 1201.0 | 91.276 |
| 1200.0 | 92.618 |
| 1199.0 | 94.607 |
| 1198.0 | 96.668 |
| 1197.0 | 98.113 |
| 1196.0 | 98.302 |
| 1195.0 | 97.116 |
| 1194.0 | 95.071 |
| 1193.0 | 92.749 |
| 1192.0 | 90.784 |
| 1191.0 | 89.703 |
| 1190.0 | 89.729 |
| 1189.0 | 90.906 |
| 1188.0 | 92.69 |
| 1187.0 | 94.593 |
| 1186.0 | 95.989 |
| 1185.0 | 96.363 |
| 1184.0 | 95.626 |
| 1183.0 | 94.049 |
| 1182.0 | 92.306 |
| 1181.0 | 90.935 |
| 1180.0 | 90.287 |
| 1179.0 | 90.594 |
| 1178.0 | 91.683 |
| 1177.0 | 93.24 |
| 1176.0 | 94.641 |
| 1175.0 | 95.412 |
| 1174.0 | 95.263 |
| 1173.0 | 94.275 |
| 1172.0 | 92.855 |
| 1171.0 | 91.574 |
| 1170.0 | 90.856 |
| 1169.0 | 90.995 |
| 1168.0 | 91.896 |
| 1167.0 | 93.323 |
| 1166.0 | 94.769 |
| 1165.0 | 95.684 |
| 1164.0 | 95.773 |
| 1163.0 | 95.069 |
| 1162.0 | 94.085 |
| 1161.0 | 93.28 |
| 1160.0 | 93.162 |
| 1159.0 | 93.84 |
| 1158.0 | 95.05 |
| 1157.0 | 96.341 |
| 1156.0 | 97.162 |
| 1155.0 | 97.166 |
| 1154.0 | 96.417 |
| 1153.0 | 95.29 |
| 1152.0 | 94.386 |
| 1151.0 | 94.254 |
| 1150.0 | 94.958 |
| 1149.0 | 96.286 |
| 1148.0 | 97.633 |
| 1147.0 | 98.34 |
| 1146.0 | 97.983 |
| 1145.0 | 96.629 |
| 1144.0 | 95.045 |
| 1143.0 | 93.667 |
| 1142.0 | 93.125 |
| 1141.0 | 93.655 |
| 1140.0 | 95.014 |
| 1139.0 | 96.599 |
| 1138.0 | 97.815 |
| 1137.0 | 98.202 |
| 1136.0 | 97.603 |
| 1135.0 | 96.412 |
| 1134.0 | 95.2 |
| 1133.0 | 94.551 |
| 1132.0 | 94.803 |
| 1131.0 | 95.824 |
| 1130.0 | 97.085 |
| 1129.0 | 98.112 |
| 1128.0 | 98.542 |
| 1127.0 | 98.195 |
| 1126.0 | 97.475 |
| 1125.0 | 96.753 |
| 1124.0 | 96.426 |
| 1123.0 | 96.602 |
| 1122.0 | 97.05 |
| 1121.0 | 97.294 |
| 1120.0 | 96.973 |
| 1119.0 | 96.068 |
| 1118.0 | 94.914 |
| 1117.0 | 94.071 |
| 1116.0 | 94.056 |
| 1115.0 | 95.032 |
| 1114.0 | 96.553 |
| 1113.0 | 97.954 |
| 1112.0 | 98.476 |
| 1111.0 | 97.735 |
| 1110.0 | 96.323 |
| 1109.0 | 94.714 |
| 1108.0 | 93.88 |
| 1107.0 | 94.207 |
| 1106.0 | 95.481 |
| 1105.0 | 97.121 |
| 1104.0 | 98.261 |
| 1103.0 | 98.273 |
| 1102.0 | 97.142 |
| 1101.0 | 95.444 |
| 1100.0 | 93.935 |
| 1099.0 | 93.505 |
| 1098.0 | 94.238 |
| 1097.0 | 95.894 |
| 1096.0 | 97.544 |
| 1095.0 | 98.453 |
| 1094.0 | 98.187 |
| 1093.0 | 96.975 |
| 1092.0 | 95.468 |
| 1091.0 | 94.661 |
| 1090.0 | 94.768 |
| 1089.0 | 95.876 |
| 1088.0 | 97.334 |
| 1087.0 | 98.351 |
| 1086.0 | 98.212 |
| 1085.0 | 96.627 |
| 1084.0 | 94.478 |
| 1083.0 | 92.461 |
| 1082.0 | 91.633 |
| 1081.0 | 92.277 |
| 1080.0 | 94.102 |
| 1079.0 | 96.303 |
| 1078.0 | 98.015 |
| 1077.0 | 98.473 |
| 1076.0 | 97.879 |
| 1075.0 | 96.613 |
| 1074.0 | 95.566 |
| 1073.0 | 95.182 |
| 1072.0 | 95.573 |
| 1071.0 | 96.51 |
| 1070.0 | 97.475 |
| 1069.0 | 98.112 |
| 1068.0 | 98.291 |
| 1067.0 | 98.226 |
| 1066.0 | 98.095 |
| 1065.0 | 98.158 |
| 1064.0 | 98.405 |
| 1063.0 | 98.817 |
| 1062.0 | 99.138 |
| 1061.0 | 99.306 |
| 1060.0 | 99.283 |
| 1059.0 | 99.207 |
| 1058.0 | 99.114 |
| 1057.0 | 99.1 |
| 1056.0 | 99.147 |
| 1055.0 | 99.187 |
| 1054.0 | 99.178 |
| 1053.0 | 99.196 |
| 1052.0 | 99.23 |
| 1051.0 | 99.274 |
| 1050.0 | 99.29 |
| 1049.0 | 99.36 |
| 1048.0 | 99.429 |
| 1047.0 | 99.473 |
| 1046.0 | 99.498 |
| 1045.0 | 99.492 |
| 1044.0 | 99.487 |
| 1043.0 | 99.395 |
| 1042.0 | 99.305 |
| 1041.0 | 99.227 |
| 1040.0 | 99.689 |
| 1039.0 | 99.102 |
| 1038.0 | 99.764 |
| 1037.0 | 92.119 |
| 1036.0 | 91.051 |
| 1035.0 | 99.359 |
| 1034.0 | 97.86 |
| 1033.0 | 98.214 |
| 1032.0 | 98.049 |
| 1031.0 | 97.091 |
| 1030.0 | 94.073 |
| 1029.0 | 93.319 |
| 1028.0 | 92.448 |
| 1027.0 | 99.98 |
| 1026.0 | 96.391 |
| 1025.0 | 98.216 |
| 1024.0 | 98.252 |
| 1023.0 | 94.961 |
| 1022.0 | 93.617 |
| 1021.0 | 94.542 |
| 1020.0 | 98.565 |
| 1019.0 | 97.943 |
| 1018.0 | 98.011 |
| 1017.0 | 98.234 |
| 1016.0 | 95.399 |
| 1015.0 | 95.069 |
| 1014.0 | 98.968 |
| 1013.0 | 98.172 |
| 1012.0 | 98.947 |
| 1011.0 | 99.037 |
| 1010.0 | 95.827 |
| 1009.0 | 94.544 |
| 1008.0 | 99.934 |
| 1007.0 | 98.821 |
| 1006.0 | 97.774 |
| 1005.0 | 97.467 |
| 1004.0 | 95.137 |
| 1003.0 | 94.945 |
| 1002.0 | 99.626 |
| 1001.0 | 98.73 |
| 1000.0 | 99.25 |
| 999.0 | 95.756 |
| 998.0 | 94.192 |
| 997.0 | 99.392 |
| 996.0 | 96.794 |
| 995.0 | 99.83 |
| 994.0 | 95.215 |
| 993.0 | 94.619 |
| 992.0 | 99.139 |
| 991.0 | 96.586 |
| 990.0 | 97.863 |
| 989.0 | 96.237 |
| 988.0 | 93.402 |
| 987.0 | 99.861 |
| 986.0 | 98.705 |
| 985.0 | 99.159 |
| 984.0 | 95.624 |
| 983.0 | 99.244 |
| 982.0 | 98.317 |
| 981.0 | 99.967 |
| 980.0 | 95.987 |
| 979.0 | 99.362 |
| 978.0 | 99.81 |
| 977.0 | 94.807 |
| 976.0 | 93.353 |
| 975.0 | 99.987 |
| 974.0 | 98.752 |
| 973.0 | 96.663 |
| 972.0 | 99.3 |
| 971.0 | 97.888 |
| 970.0 | 98.861 |
| 969.0 | 95.958 |
| 968.0 | 99.021 |
| 967.0 | 99.375 |
| 966.0 | 98.685 |
| 965.0 | 98.284 |
| 964.0 | 99.324 |
| 963.0 | 94.753 |
| 962.0 | 99.154 |
| 961.0 | 95.538 |
| 960.0 | 99.463 |
| 959.0 | 93.433 |
| 958.0 | 93.059 |
| 957.0 | 99.992 |
| 956.0 | 95.979 |
| 955.0 | 99.969 |
| 954.0 | 93.014 |
| 953.0 | 92.413 |
| 952.0 | 99.263 |
| 951.0 | 93.776 |
| 950.0 | 99.031 |
| 949.0 | 93.592 |
| 948.0 | 92.804 |
| 947.0 | 99.716 |
| 946.0 | 97.193 |
| 945.0 | 99.884 |
| 944.0 | 95.107 |
| 943.0 | 97.446 |
| 942.0 | 99.689 |
| 941.0 | 97.433 |
| 940.0 | 94.514 |
| 939.0 | 99.786 |
| 938.0 | 95.499 |
| 937.0 | 98.895 |
| 936.0 | 96.367 |
| 935.0 | 99.248 |
| 934.0 | 99.419 |
| 933.0 | 97.972 |
| 932.0 | 93.001 |
| 931.0 | 94.173 |
| 930.0 | 98.926 |
| 929.0 | 94.149 |
| 928.0 | 97.427 |
| 927.0 | 98.434 |
| 926.0 | 96.089 |
| 925.0 | 99.282 |
| 924.0 | 97.267 |
| 923.0 | 99.365 |
| 922.0 | 93.491 |
| 921.0 | 93.536 |
| 920.0 | 99.705 |
| 919.0 | 96.381 |
| 918.0 | 99.815 |
| 917.0 | 99.151 |
| 916.0 | 98.31 |
| 915.0 | 95.399 |
| 914.0 | 97.929 |
| 913.0 | 97.688 |
| 912.0 | 98.781 |
| 911.0 | 97.81 |
| 910.0 | 99.021 |
| 909.0 | 97.388 |
| 908.0 | 95.14 |
| 907.0 | 97.636 |
| 906.0 | 98.997 |
| 905.0 | 98.654 |
| 904.0 | 99.535 |
| 903.0 | 99.948 |
| 902.0 | 99.431 |
| 901.0 | 96.227 |
| 900.0 | 93.937 |
| 899.0 | 98.605 |
| 898.0 | 96.022 |
| 897.0 | 97.525 |
| 896.0 | 96.074 |
| 895.0 | 97.029 |
| 894.0 | 99.303 |
| 893.0 | 97.55 |
| 892.0 | 98.718 |
| 891.0 | 98.301 |
| 890.0 | 95.278 |
| 889.0 | 96.122 |
| 888.0 | 97.914 |
| 887.0 | 98.618 |
| 886.0 | 97.583 |
| 885.0 | 97.49 |
| 884.0 | 99.102 |
| 883.0 | 98.863 |
| 882.0 | 98.693 |
| 881.0 | 98.462 |
| 880.0 | 97.732 |
| 879.0 | 96.963 |
| 878.0 | 97.511 |
| 877.0 | 99.241 |
| 876.0 | 99.465 |
| 875.0 | 98.213 |
| 874.0 | 98.347 |
| 873.0 | 99.942 |
| 872.0 | 98.719 |
| 871.0 | 97.385 |
| 870.0 | 96.144 |
| 869.0 | 95.233 |
| 868.0 | 96.506 |
| 867.0 | 98.718 |
| 866.0 | 99.948 |
| 865.0 | 99.472 |
| 864.0 | 97.56 |
| 863.0 | 97.202 |
| 862.0 | 99.375 |
| 861.0 | 99.562 |
| 860.0 | 99.454 |
| 859.0 | 99.785 |
| 858.0 | 98.94 |
| 857.0 | 98.633 |
| 856.0 | 98.951 |
| 855.0 | 98.745 |
| 854.0 | 98.691 |
| 853.0 | 98.988 |
| 852.0 | 99.004 |
| 851.0 | 99.005 |
| 850.0 | 99.345 |
| 849.0 | 99.01 |
| 848.0 | 99.411 |
| 847.0 | 99.566 |
| 846.0 | 98.401 |
| 845.0 | 98.284 |
| 844.0 | 98.595 |
| 843.0 | 98.397 |
| 842.0 | 97.916 |
| 841.0 | 98.47 |
| 840.0 | 99.116 |
| 839.0 | 98.388 |
| 838.0 | 98.28 |
| 837.0 | 98.94 |
| 836.0 | 98.991 |
| 835.0 | 98.116 |
| 834.0 | 97.76 |
| 833.0 | 97.829 |
| 832.0 | 97.484 |
| 831.0 | 97.522 |
| 830.0 | 97.989 |
| 829.0 | 98.554 |
| 828.0 | 98.447 |
| 827.0 | 98.584 |
| 826.0 | 98.631 |
| 825.0 | 98.567 |
| 824.0 | 98.253 |
| 823.0 | 97.85 |
| 822.0 | 97.961 |
| 821.0 | 98.928 |
| 820.0 | 98.402 |
| 819.0 | 97.703 |
| 818.0 | 98.032 |
| 817.0 | 98.539 |
| 816.0 | 97.819 |
| 815.0 | 97.532 |
| 814.0 | 97.917 |
| 813.0 | 98.309 |
| 812.0 | 98.657 |
| 811.0 | 98.882 |
| 810.0 | 98.85 |
| 809.0 | 98.706 |
| 808.0 | 98.606 |
| 807.0 | 98.847 |
| 806.0 | 99.028 |
| 805.0 | 98.838 |
| 804.0 | 97.998 |
| 803.0 | 97.157 |
| 802.0 | 81.603 |
| 801.0 | 39.593 |
| 800.0 | 8.623 |
| 799.0 | 0.754 |
| 798.0 | 0.06 |
| 797.0 | 0.003 |
| 796.0 | 0.001 |
| 795.0 | 0 |
| 794.0 | 0 |
| 793.0 | 0 |
| 792.0 | 0 |
| 791.0 | 0 |
| 790.0 | 0 |
| 789.0 | 0 |
| 788.0 | 0 |
| 787.0 | 0 |
| 786.0 | 0 |
| 785.0 | 0 |
| 784.0 | 0 |
| 783.0 | 0 |
| 782.0 | 0 |
| 781.0 | 0 |
| 780.0 | 0 |
| 779.0 | 0 |
| 778.0 | 0 |
| 777.0 | 0 |
| 776.0 | 0.001 |
| 775.0 | 0.007 |
| 774.0 | 0.198 |
| 773.0 | 4.883 |
| 772.0 | 32.927 |
| 771.0 | 71.215 |
| 770.0 | 90.615 |
| 769.0 | 96.341 |
| 768.0 | 98.429 |
| 767.0 | 98.941 |
| 766.0 | 98.849 |
| 765.0 | 98.405 |
| 764.0 | 98.467 |
| 763.0 | 98.522 |
| 762.0 | 98.84 |
| 761.0 | 98.507 |
| 760.0 | 97.438 |
| 759.0 | 97.453 |
| 758.0 | 98.125 |
| 757.0 | 97.552 |
| 756.0 | 97.726 |
| 755.0 | 98.377 |
| 754.0 | 98.483 |
| 753.0 | 98.208 |
| 752.0 | 98.357 |
| 751.0 | 98.254 |
| 750.0 | 97.858 |
| 749.0 | 97.955 |
| 748.0 | 98.513 |
| 747.0 | 98.282 |
| 746.0 | 98.291 |
| 745.0 | 98.282 |
| 744.0 | 98.333 |
| 743.0 | 98.047 |
| 742.0 | 98.185 |
| 741.0 | 98.45 |
| 740.0 | 97.859 |
| 739.0 | 98.392 |
| 738.0 | 98.659 |
| 737.0 | 98.128 |
| 736.0 | 98.443 |
| 735.0 | 98.19 |
| 734.0 | 99.007 |
| 733.0 | 98.394 |
| 732.0 | 99.288 |
| 731.0 | 98.985 |
| 730.0 | 98.042 |
| 729.0 | 98.162 |
| 728.0 | 98.539 |
| 727.0 | 98.703 |
| 726.0 | 98.62 |
| 725.0 | 98.309 |
| 724.0 | 98.484 |
| 723.0 | 98.705 |
| 722.0 | 98.719 |
| 721.0 | 98.084 |
| 720.0 | 98.892 |
| 719.0 | 99.374 |
| 718.0 | 99.334 |
| 717.0 | 99.307 |
| 716.0 | 99.441 |
| 715.0 | 99.18 |
| 714.0 | 99.672 |
| 713.0 | 99.233 |
| 712.0 | 99.445 |
| 711.0 | 99.012 |
| 710.0 | 99.153 |
| 709.0 | 99.009 |
| 708.0 | 99.038 |
| 707.0 | 98.963 |
| 706.0 | 99.499 |
| 705.0 | 98.629 |
| 704.0 | 99.069 |
| 703.0 | 99.002 |
| 702.0 | 99.094 |
| 701.0 | 99.308 |
| 700.0 | 98.727 |
| 699.0 | 99.032 |
| 698.0 | 98.819 |
| 697.0 | 98.548 |
| 696.0 | 98.357 |
| 695.0 | 98.558 |
| 694.0 | 98.264 |
| 693.0 | 98.499 |
| 692.0 | 98.17 |
| 691.0 | 98.333 |
| 690.0 | 98.8 |
| 689.0 | 98.445 |
| 688.0 | 98.091 |
| 687.0 | 97.913 |
| 686.0 | 98.809 |
| 685.0 | 98.067 |
| 684.0 | 98.314 |
| 683.0 | 98.094 |
| 682.0 | 98.124 |
| 681.0 | 98.662 |
| 680.0 | 98.385 |
| 679.0 | 98.257 |
| 678.0 | 98.327 |
| 677.0 | 98.283 |
| 676.0 | 98.462 |
| 675.0 | 98.526 |
| 674.0 | 98.401 |
| 673.0 | 98.466 |
| 672.0 | 98.066 |
| 671.0 | 98.017 |
| 670.0 | 97.967 |
| 669.0 | 98.147 |
| 668.0 | 97.967 |
| 667.0 | 97.518 |
| 666.0 | 98.167 |
| 665.0 | 98.759 |
| 664.0 | 97.773 |
| 663.0 | 98.732 |
| 662.0 | 98.962 |
| 661.0 | 98.933 |
| 660.0 | 98.912 |
| 659.0 | 98.69 |
| 658.0 | 98.806 |
| 657.0 | 98.758 |
| 656.0 | 98.878 |
| 655.0 | 98.797 |
| 654.0 | 98.409 |
| 653.0 | 98.519 |
| 652.0 | 98.54 |
| 651.0 | 98.939 |
| 650.0 | 98.988 |
| 649.0 | 98.468 |
| 648.0 | 98.716 |
| 647.0 | 98.955 |
| 646.0 | 98.601 |
| 645.0 | 98.941 |
| 644.0 | 99.157 |
| 643.0 | 98.818 |
| 642.0 | 98.77 |
| 641.0 | 99.125 |
| 640.0 | 99.421 |
| 639.0 | 99.507 |
| 638.0 | 98.939 |
| 637.0 | 98.791 |
| 636.0 | 99.387 |
| 635.0 | 98.748 |
| 634.0 | 98.934 |
| 633.0 | 98.718 |
| 632.0 | 98.706 |
| 631.0 | 98.224 |
| 630.0 | 99.368 |
| 629.0 | 98.953 |
| 628.0 | 98.936 |
| 627.0 | 99.008 |
| 626.0 | 98.81 |
| 625.0 | 99.089 |
| 624.0 | 99.031 |
| 623.0 | 98.659 |
| 622.0 | 99.167 |
| 621.0 | 98.964 |
| 620.0 | 99.361 |
| 619.0 | 99.283 |
| 618.0 | 98.666 |
| 617.0 | 98.416 |
| 616.0 | 98.581 |
| 615.0 | 98.456 |
| 614.0 | 98.813 |
| 613.0 | 98.95 |
| 612.0 | 99.116 |
| 611.0 | 99.154 |
| 610.0 | 98.948 |
| 609.0 | 99.192 |
| 608.0 | 99.504 |
| 607.0 | 99.753 |
| 606.0 | 99.658 |
| 605.0 | 99.242 |
| 604.0 | 99.86 |
| 603.0 | 99.85 |
| 602.0 | 99.892 |
| 601.0 | 99.838 |
| 600.0 | 99.649 |
| 599.0 | 99.782 |
| 598.0 | 99.875 |
| 597.0 | 99.477 |
| 596.0 | 99.823 |
| 595.0 | 99.403 |
| 594.0 | 99.922 |
| 593.0 | 99.793 |
| 592.0 | 99.944 |
| 591.0 | 99.655 |
| 590.0 | 99.151 |
| 589.0 | 98.454 |
| 588.0 | 98.444 |
| 587.0 | 98.389 |
| 586.0 | 98.362 |
| 585.0 | 98.357 |
| 584.0 | 98.226 |
| 583.0 | 98.077 |
| 582.0 | 97.739 |
| 581.0 | 95.295 |
| 580.0 | 88.798 |
| 579.0 | 83.207 |
| 578.0 | 81.292 |
| 577.0 | 78.682 |
| 576.0 | 74.107 |
| 575.0 | 70.192 |
| 574.0 | 66.559 |
| 573.0 | 58.373 |
| 572.0 | 50.255 |
| 571.0 | 45.848 |
| 570.0 | 44.126 |
| 569.0 | 44.776 |
| 568.0 | 44.426 |
| 567.0 | 44.438 |
| 566.0 | 45.426 |
| 565.0 | 45.789 |
| 564.0 | 44.295 |
| 563.0 | 39.504 |
| 562.0 | 32.077 |
| 561.0 | 25.601 |
| 560.0 | 21.869 |
| 559.0 | 18.165 |
| 558.0 | 15.393 |
| 557.0 | 15.077 |
| 556.0 | 14.925 |
| 555.0 | 12.985 |
| 554.0 | 10.155 |
| 553.0 | 7.866 |
| 552.0 | 6.678 |
| 551.0 | 6.202 |
| 550.0 | 5.475 |
| 549.0 | 4.317 |
| 548.0 | 3.163 |
| 547.0 | 2.298 |
| 546.0 | 1.99 |
| 545.0 | 1.766 |
| 544.0 | 1.187 |
| 543.0 | 0.676 |
| 542.0 | 0.455 |
| 541.0 | 0.313 |
| 540.0 | 0.164 |
| 539.0 | 0.06 |
| 538.0 | 0.018 |
| 537.0 | 0.001 |
| 536.0 | 0.005 |
| 535.0 | 0.005 |
| 534.0 | 0.003 |
| 533.0 | 0.004 |
| 532.0 | 0.002 |
| 531.0 | 0.003 |
| 530.0 | 0.006 |
| 529.0 | 0.006 |
| 528.0 | 0.005 |
| 527.0 | 0.003 |
| 526.0 | 0.001 |
| 525.0 | 0.004 |
| 524.0 | 0.006 |
| 523.0 | 0.006 |
| 522.0 | 0.006 |
| 521.0 | 0.004 |
| 520.0 | 0.002 |
| 519.0 | 0.003 |
| 518.0 | 0.006 |
| 517.0 | 0.006 |
| 516.0 | 0.006 |
| 515.0 | 0.004 |
| 514.0 | 0.002 |
| 513.0 | 0.003 |
| 512.0 | 0.006 |
| 511.0 | 0.005 |
| 510.0 | 0.005 |
| 509.0 | 0.003 |
| 508.0 | 0.002 |
| 507.0 | 0.003 |
| 506.0 | 0.005 |
| 505.0 | 0.005 |
| 504.0 | 0.005 |
| 503.0 | 0.003 |
| 502.0 | 0.002 |
| 501.0 | 0.004 |
| 500.0 | 0.006 |
| 499.0 | 0.004 |
| 498.0 | 0.004 |
| 497.0 | 0.004 |
| 496.0 | 0.001 |
| 495.0 | 0.004 |
| 494.0 | 0.006 |
| 493.0 | 0.006 |
| 492.0 | 0.005 |
| 491.0 | 0.003 |
| 490.0 | 0.001 |
| 489.0 | 0.003 |
| 488.0 | 0.005 |
| 487.0 | 0.005 |
| 486.0 | 0.005 |
| 485.0 | 0.003 |
| 484.0 | 0.002 |
| 483.0 | 0.004 |
| 482.0 | 0.006 |
| 481.0 | 0.006 |
| 480.0 | 0.006 |
| 479.0 | 0.004 |
| 478.0 | 0.002 |
| 477.0 | 0.004 |
| 476.0 | 0.006 |
| 475.0 | 0.005 |
| 474.0 | 0.004 |
| 473.0 | 0.004 |
| 472.0 | 0.003 |
| 471.0 | 0.005 |
| 470.0 | 0.006 |
| 469.0 | 0.005 |
| 468.0 | 0.004 |
| 467.0 | 0.003 |
| 466.0 | 0.002 |
| 465.0 | 0.004 |
| 464.0 | 0.006 |
| 463.0 | 0.006 |
| 462.0 | 0.006 |
| 461.0 | 0.004 |
| 460.0 | 0.002 |
| 459.0 | 0.004 |
| 458.0 | 0.006 |
| 457.0 | 0.006 |
| 456.0 | 0.005 |
| 455.0 | 0.003 |
| 454.0 | 0.001 |
| 453.0 | 0.004 |
| 452.0 | 0.006 |
| 451.0 | 0.006 |
| 450.0 | 0.005 |
| 449.0 | 0.003 |
| 448.0 | 0.002 |
| 447.0 | 0.004 |
| 446.0 | 0.006 |
| 445.0 | 0.005 |
| 444.0 | 0.005 |
| 443.0 | 0.003 |
| 442.0 | 0.002 |
| 441.0 | 0.004 |
| 440.0 | 0.006 |
| 439.0 | 0.004 |
| 438.0 | 0.004 |
| 437.0 | 0.003 |
| 436.0 | 0.001 |
| 435.0 | 0.004 |
| 434.0 | 0.005 |
| 433.0 | 0.006 |
| 432.0 | 0.005 |
| 431.0 | 0.003 |
| 430.0 | 0.001 |
| 429.0 | 0.004 |
| 428.0 | 0.005 |
| 427.0 | 0.005 |
| 426.0 | 0.004 |
| 425.0 | 0.003 |
| 424.0 | 0.002 |
| 423.0 | 0.004 |
| 422.0 | 0.005 |
| 421.0 | 0.006 |
| 420.0 | 0.005 |
| 419.0 | 0.002 |
| 418.0 | 0.001 |
| 417.0 | 0.004 |
| 416.0 | 0.006 |
| 415.0 | 0.006 |
| 414.0 | 0.005 |
| 413.0 | 0.003 |
| 412.0 | 0.001 |
| 411.0 | 0.005 |
| 410.0 | 0.005 |
| 409.0 | 0.005 |
| 408.0 | 0.005 |
| 407.0 | 0.002 |
| 406.0 | 0.001 |
| 405.0 | 0.004 |
| 404.0 | 0.005 |
| 403.0 | 0.004 |
| 402.0 | 0.004 |
| 401.0 | 0.003 |
| 400.0 | 0.002 |
| 399.0 | 0.005 |
| 398.0 | 0.006 |
| 397.0 | 0.004 |
| 396.0 | 0.005 |
| 395.0 | 0.002 |
| 394.0 | 0.002 |
| 393.0 | 0.005 |
| 392.0 | 0.006 |
| 391.0 | 0.005 |
| 390.0 | 0.006 |
| 389.0 | 0.001 |
| 388.0 | 0.003 |
| 387.0 | 0.012 |
| 386.0 | 0.021 |
| 385.0 | 0.047 |
| 384.0 | 0.414 |
| 383.0 | 1.31 |
| 382.0 | 1.816 |
| 381.0 | 1.164 |
| 380.0 | 0.359 |
| 379.0 | 0.104 |
| 378.0 | 0.064 |
| 377.0 | 0.04 |
| 376.0 | 0.02 |
| 375.0 | 0.012 |
| 374.0 | 0.02 |
| 373.0 | 0.046 |
| 372.0 | 0.102 |
| 371.0 | 0.168 |
| 370.0 | 0.167 |
| 369.0 | 0.097 |
| 368.0 | 0.04 |
| 367.0 | 0.03 |
| 366.0 | 0.055 |
| 365.0 | 0.161 |
| 364.0 | 0.3 |
| 363.0 | 0.374 |
| 362.0 | 0.352 |
| 361.0 | 0.24 |
| 360.0 | 0.101 |
| 359.0 | 0.03 |
| 358.0 | 0.015 |
| 357.0 | 0.016 |
| 356.0 | 0.013 |
| 355.0 | 0.014 |
| 354.0 | 0.007 |
| 353.0 | 0.002 |
| 352.0 | 0.003 |
| 351.0 | 0.001 |
| 350.0 | 0.005 |
| 349.0 | 0.001 |
| 348.0 | 0.001 |
| 347.0 | 0.002 |
| 346.0 | 0.006 |
| 345.0 | 0.002 |
| 344.0 | 0.006 |
| 343.0 | 0.003 |
| 342.0 | 0.002 |
| 341.0 | 0.004 |
| 340.0 | 0.005 |
| 339.0 | 0.002 |
| 338.0 | 0.005 |
| 337.0 | 0.001 |
| 336.0 | 0.001 |
| 335.0 | 0.003 |
| 334.0 | 0.006 |
| 333.0 | 0.003 |
| 332.0 | 0.005 |
| 331.0 | 0.002 |
| 330.0 | 0.001 |
| 329.0 | 0.005 |
| 328.0 | 0.006 |
| 327.0 | 0.003 |
| 326.0 | 0.005 |
| 325.0 | 0.002 |
| 324.0 | 0.002 |
| 323.0 | 0.005 |
| 322.0 | 0.005 |
| 321.0 | 0.003 |
| 320.0 | 0.005 |
| 319.0 | 0.002 |
| 318.0 | 0.005 |
| 317.0 | 0.005 |
| 316.0 | 0.006 |
| 315.0 | 0.001 |
| 314.0 | 0.005 |
| 313.0 | 0.001 |
| 312.0 | 0.001 |
| 311.0 | 0.004 |
| 310.0 | 0.007 |
| 309.0 | 0.001 |
| 308.0 | 0.005 |
| 307.0 | 0.001 |
| 306.0 | 0.003 |
| 305.0 | 0.004 |
| 304.0 | 0.007 |
| 303.0 | 0.004 |
| 302.0 | 0.005 |
| 301.0 | 0 |
| 300.0 | 0.002 |
| 299.0 | 0.004 |
| 298.0 | 0.007 |
| 297.0 | 0.003 |
| 296.0 | 0.005 |
| 295.0 | 0 |
| 294.0 | 0.002 |
| 293.0 | 0.005 |
| 292.0 | 0.006 |
| 291.0 | 0.005 |
| 290.0 | 0.005 |
| 289.0 | 0 |
| 288.0 | 0.001 |
| 287.0 | 0.005 |
| 286.0 | 0.007 |
| 285.0 | 0.001 |
| 284.0 | 0.005 |
| 283.0 | 0.001 |
| 282.0 | 0.001 |
| 281.0 | 0.005 |
| 280.0 | 0.005 |
| 279.0 | 0.005 |
| 278.0 | 0.005 |
| 277.0 | 0.001 |
| 276.0 | 0.002 |
| 275.0 | 0.005 |
| 274.0 | 0.006 |
| 273.0 | 0.005 |
| 272.0 | 0.005 |
| 271.0 | 0.002 |
| 270.0 | 0.001 |
| 269.0 | 0.007 |
| 268.0 | 0.005 |
| 267.0 | 0.003 |
| 266.0 | 0.002 |
| 265.0 | 0.002 |
| 264.0 | 0.001 |
| 263.0 | 0.006 |
| 262.0 | 0.005 |
| 261.0 | 0.003 |
| 260.0 | 0.005 |
| 259.0 | 0.003 |
| 258.0 | 0.001 |
| 257.0 | 0.006 |
| 256.0 | 0.004 |
| 255.0 | 0.002 |
| 254.0 | 0.005 |
| 253.0 | 0.002 |
| 252.0 | 0.003 |
| 251.0 | 0.008 |
| 250.0 | 0.006 |
| 249.0 | 0.006 |
| 248.0 | 0.005 |
| 247.0 | 0.002 |
| 246.0 | 0.002 |
| 245.0 | 0.006 |
| 244.0 | 0.005 |
| 243.0 | 0.001 |
| 242.0 | 0.005 |
| 241.0 | 0.002 |
| 240.0 | 0.001 |
| 239.0 | 0.006 |
| 238.0 | 0.006 |
| 237.0 | 0.006 |
| 236.0 | 0.004 |
| 235.0 | 0.001 |
| 234.0 | 0.002 |
| 233.0 | 0.007 |
| 232.0 | 0.005 |
| 231.0 | 0.002 |
| 230.0 | 0.006 |
| 229.0 | 0.002 |
| 228.0 | 0.003 |
| 227.0 | 0.005 |
| 226.0 | 0.007 |
| 225.0 | 0.004 |
| 224.0 | 0.006 |
| 223.0 | 0.002 |
| 222.0 | 0.003 |
| 221.0 | 0.005 |
| 220.0 | 0.007 |
| 219.0 | 0.003 |
| 218.0 | 0.006 |
| 217.0 | 0.002 |
| 216.0 | 0.004 |
| 215.0 | 0.006 |
| 214.0 | 0.008 |
| 213.0 | 0.003 |
| 212.0 | 0.006 |
| 211.0 | 0.002 |
| 210.0 | 0.004 |
| 209.0 | 0.006 |
| 208.0 | 0.008 |
| 207.0 | 0.006 |
| 206.0 | 0.007 |
| 205.0 | 0.004 |
| 204.0 | 0.005 |
| 203.0 | 0.008 |
| 202.0 | 0.01 |
| 201.0 | 0.011 |
| 200.0 | 0.011 |